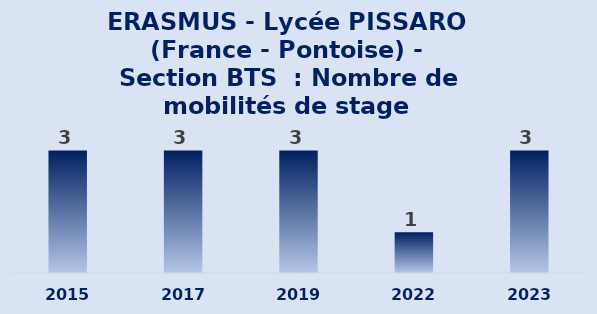
| Category | ERASMUS - Lycée PISSARO (France - Pontoise) - Section BTS : Nombre de mobilités de stage |
|---|---|
| 2015 | 3 |
| 2017 | 3 |
| 2019 | 3 |
| 2022 | 1 |
| 2023 | 3 |